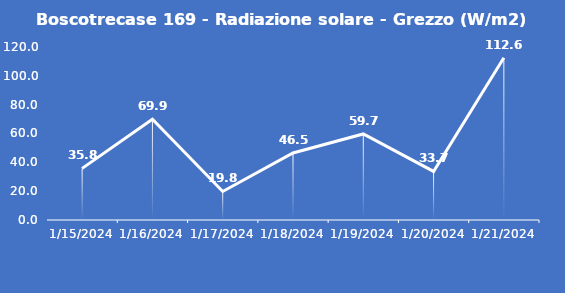
| Category | Boscotrecase 169 - Radiazione solare - Grezzo (W/m2) |
|---|---|
| 1/15/24 | 35.8 |
| 1/16/24 | 69.9 |
| 1/17/24 | 19.8 |
| 1/18/24 | 46.5 |
| 1/19/24 | 59.7 |
| 1/20/24 | 33.7 |
| 1/21/24 | 112.6 |